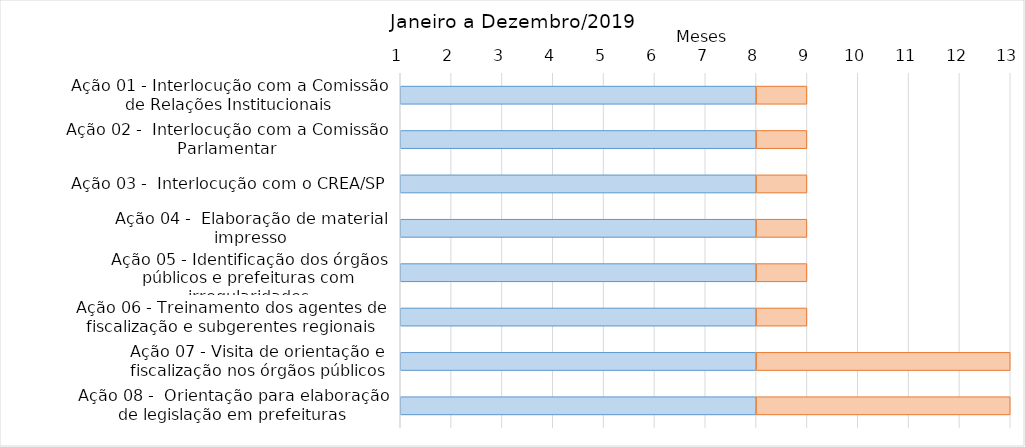
| Category | B Início | C Duração |
|---|---|---|
| Ação 01 - Interlocução com a Comissão de Relações Institucionais | 8 | 1 |
| Ação 02 -  Interlocução com a Comissão Parlamentar | 8 | 1 |
| Ação 03 -  Interlocução com o CREA/SP | 8 | 1 |
| Ação 04 -  Elaboração de material impresso | 8 | 1 |
| Ação 05 - Identificação dos órgãos públicos e prefeituras com irregularidades | 8 | 1 |
| Ação 06 - Treinamento dos agentes de fiscalização e subgerentes regionais | 8 | 1 |
| Ação 07 - Visita de orientação e fiscalização nos órgãos públicos | 8 | 5 |
| Ação 08 -  Orientação para elaboração de legislação em prefeituras | 8 | 5 |